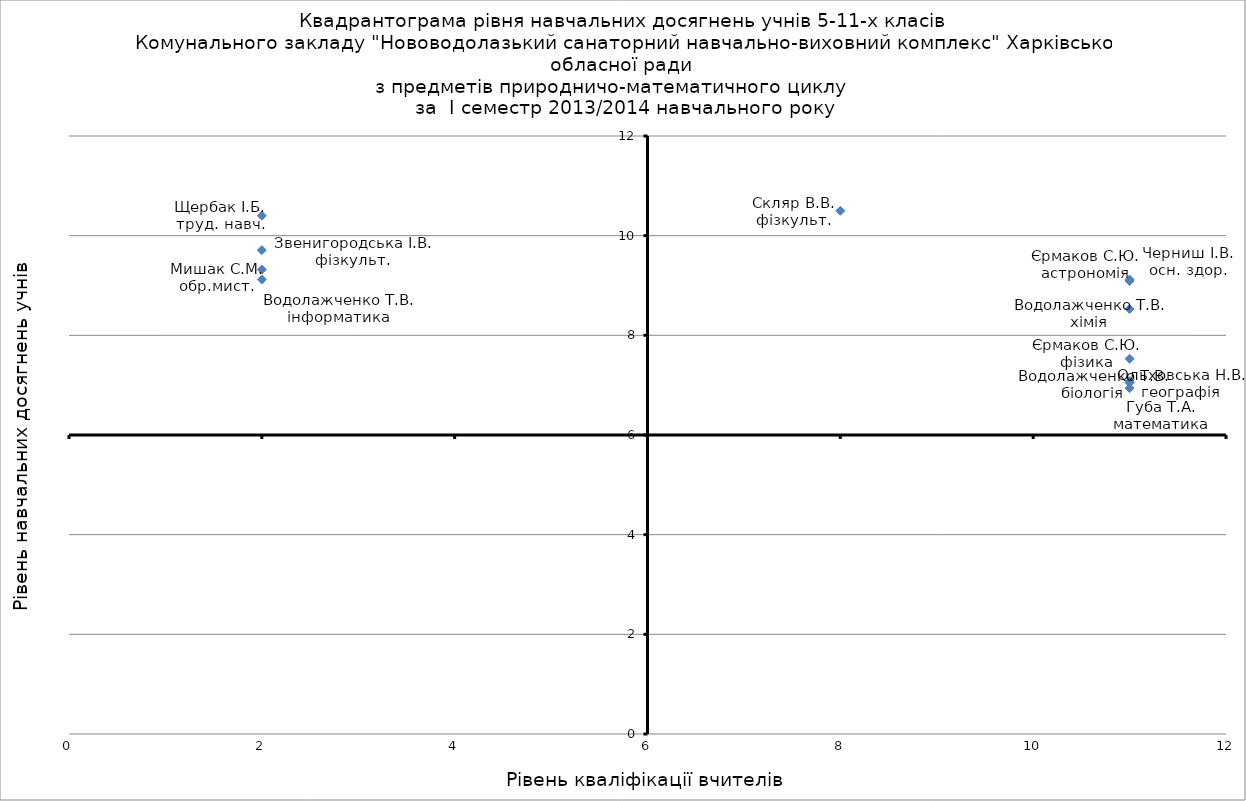
| Category | Series 0 |
|---|---|
| 11.0 | 7.53 |
| 11.0 | 6.94 |
| 11.0 | 8.53 |
| 11.0 | 7.05 |
| 11.0 | 9.09 |
| 8.0 | 10.5 |
| 2.0 | 10.4 |
| 2.0 | 9.32 |
| 11.0 | 7.08 |
| 2.0 | 9.12 |
| 11.0 | 9.12 |
| 2.0 | 9.71 |